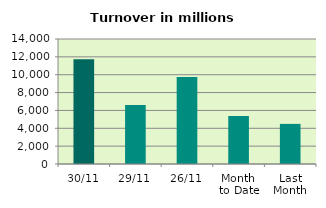
| Category | Series 0 |
|---|---|
| 30/11 | 11720.407 |
| 29/11 | 6614.877 |
| 26/11 | 9752.687 |
| Month 
to Date | 5362.851 |
| Last
Month | 4491.272 |